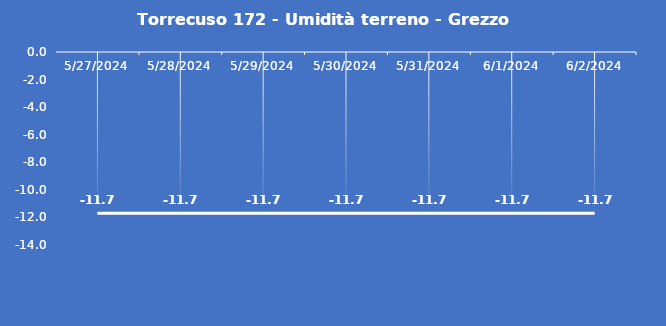
| Category | Torrecuso 172 - Umidità terreno - Grezzo (%VWC) |
|---|---|
| 5/27/24 | -11.7 |
| 5/28/24 | -11.7 |
| 5/29/24 | -11.7 |
| 5/30/24 | -11.7 |
| 5/31/24 | -11.7 |
| 6/1/24 | -11.7 |
| 6/2/24 | -11.7 |